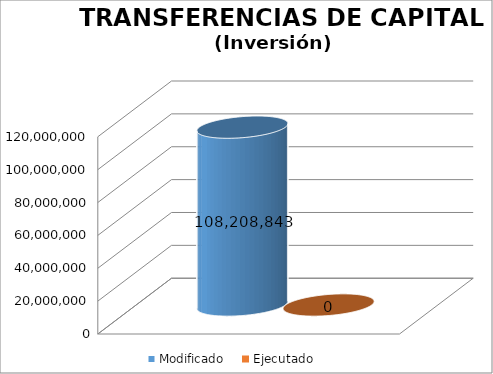
| Category | Modificado | Ejecutado |
|---|---|---|
| 0 | 108208843 | 0 |